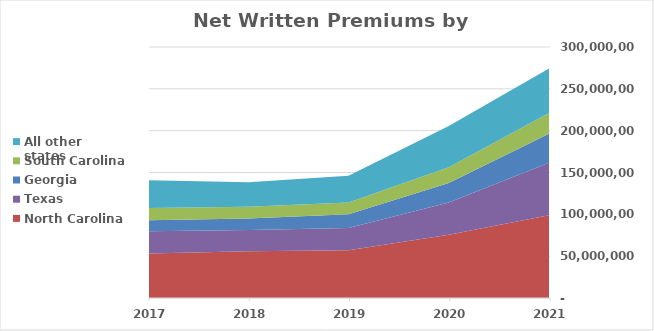
| Category | North Carolina | Texas | Georgia | South Carolina | All other states |
|---|---|---|---|---|---|
| 2021.0 | 99049000 | 62557000 | 34619000 | 24981000 | 53197000 |
| 2020.0 | 75697000 | 38350000 | 23502000 | 18752000 | 49410000 |
| 2019.0 | 57132000 | 26652000 | 16422000 | 13796000 | 32249000 |
| 2018.0 | 55772000 | 25574000 | 13592000 | 14172000 | 29338000 |
| 2017.0 | 53169000 | 26546000 | 13166000 | 14732000 | 33150000 |